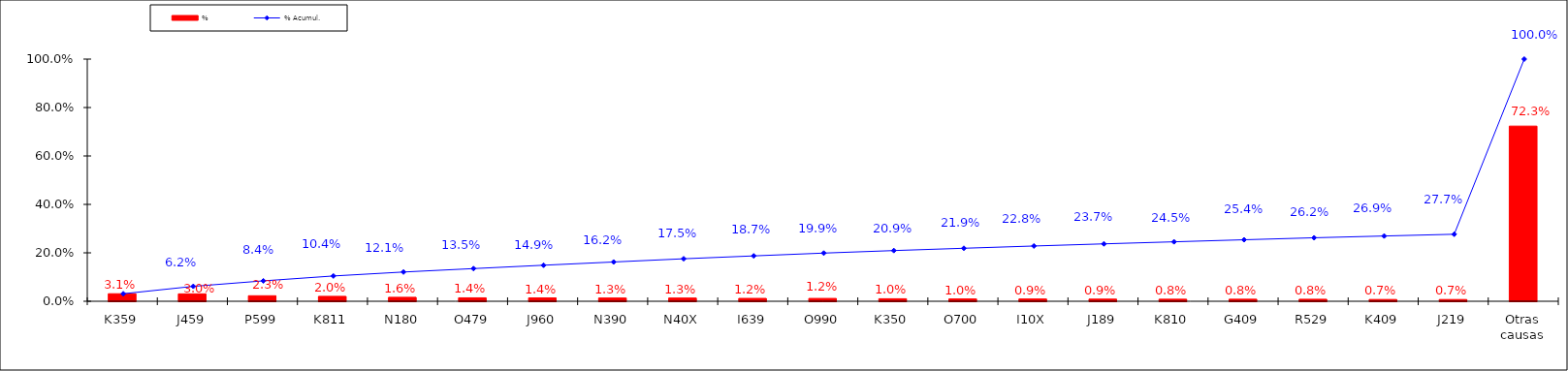
| Category | % |
|---|---|
| K359 | 0.031 |
| J459 | 0.03 |
| P599 | 0.023 |
| K811 | 0.02 |
| N180 | 0.016 |
| O479 | 0.014 |
| J960 | 0.014 |
| N390 | 0.013 |
| N40X | 0.013 |
| I639 | 0.012 |
| O990 | 0.012 |
| K350 | 0.01 |
| O700 | 0.01 |
| I10X | 0.009 |
| J189 | 0.009 |
| K810 | 0.008 |
| G409 | 0.008 |
| R529 | 0.008 |
| K409 | 0.007 |
| J219 | 0.007 |
| Otras causas | 0.723 |